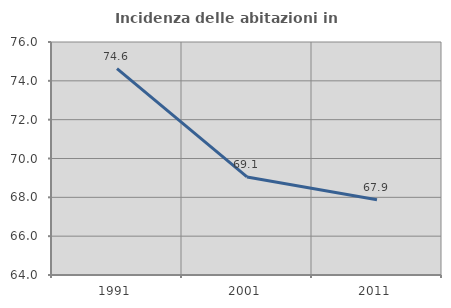
| Category | Incidenza delle abitazioni in proprietà  |
|---|---|
| 1991.0 | 74.633 |
| 2001.0 | 69.05 |
| 2011.0 | 67.874 |